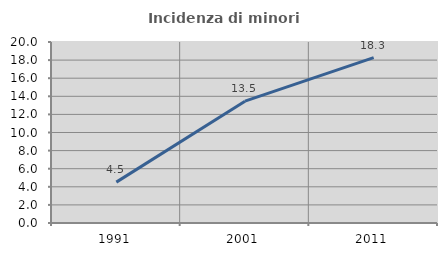
| Category | Incidenza di minori stranieri |
|---|---|
| 1991.0 | 4.516 |
| 2001.0 | 13.462 |
| 2011.0 | 18.273 |